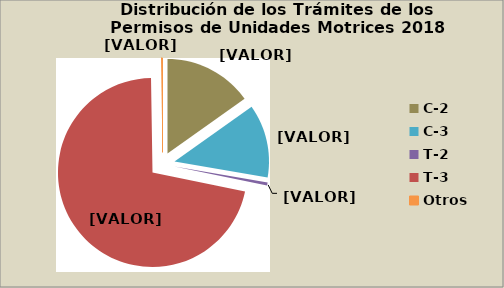
| Category | Series 0 |
|---|---|
| C-2 | 15.185 |
| C-3 | 12.524 |
| T-2 | 0.533 |
| T-3 | 71.508 |
| Otros | 0.25 |